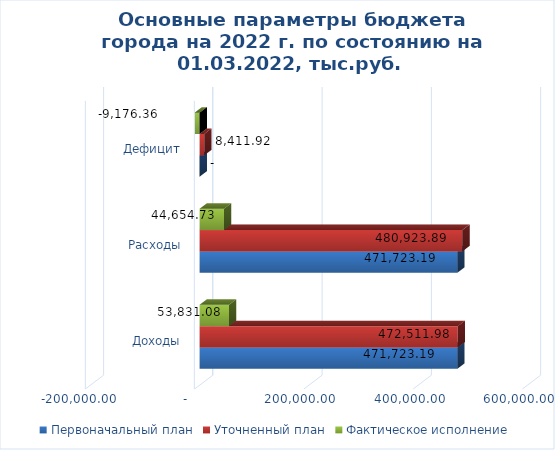
| Category | Первоначальный план | Уточненный план | Фактическое исполнение |
|---|---|---|---|
| Доходы | 471723.193 | 472511.977 | 53831.084 |
| Расходы | 471723.193 | 480923.895 | 44654.727 |
| Дефицит | 0 | 8411.918 | -9176.357 |